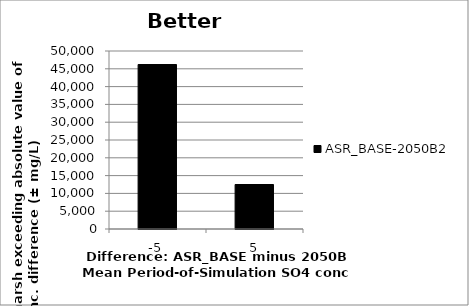
| Category | ASR_BASE-2050B2 |
|---|---|
| -5.0 | 46200 |
| 5.0 | 12500 |